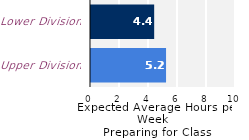
| Category | Series 0 |
|---|---|
| Upper Division | 5.176 |
| Lower Division | 4.357 |